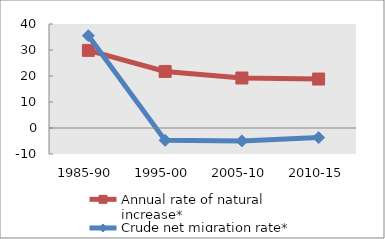
| Category | Annual rate of natural increase* | Crude net migration rate* |
|---|---|---|
| 1985-90 | 29.857 | 35.497 |
| 1995-00 | 21.743 | -4.759 |
| 2005-10 | 19.226 | -4.958 |
| 2010-15 | 18.831 | -3.691 |